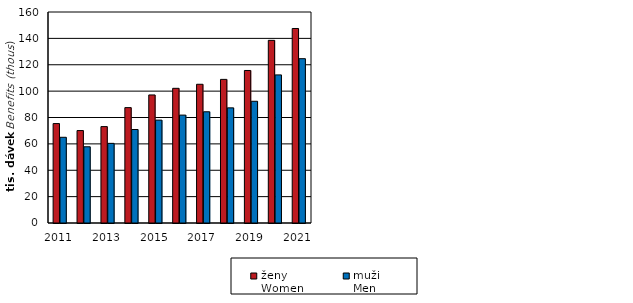
| Category | ženy  
Women | muži  
Men |
|---|---|---|
| 2011.0 | 75.4 | 65 |
| 2012.0 | 70.1 | 57.8 |
| 2013.0 | 73.1 | 60.4 |
| 2014.0 | 87.5 | 70.9 |
| 2015.0 | 97.1 | 78 |
| 2016.0 | 102.128 | 81.818 |
| 2017.0 | 105.196 | 84.343 |
| 2018.0 | 108.904 | 87.321 |
| 2019.0 | 115.66 | 92.304 |
| 2020.0 | 138.5 | 112.3 |
| 2021.0 | 147.5 | 124.6 |